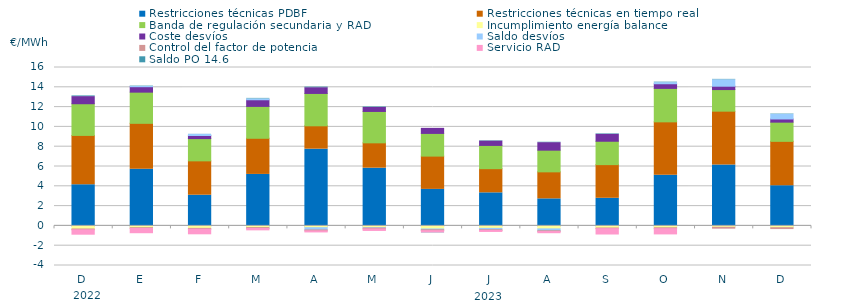
| Category | Restricciones técnicas PDBF | Restricciones técnicas en tiempo real | Banda de regulación secundaria y RAD | Incumplimiento energía balance | Coste desvíos | Saldo desvíos | Control del factor de potencia | Servicio RAD | Saldo PO 14.6 |
|---|---|---|---|---|---|---|---|---|---|
| D | 4.15 | 4.99 | 3.2 | -0.31 | 0.72 | 0 | -0.08 | -0.55 | 0.07 |
| E | 5.72 | 4.64 | 3.15 | -0.18 | 0.55 | 0.02 | -0.08 | -0.53 | 0.04 |
| F | 3.1 | 3.47 | 2.248 | -0.25 | 0.314 | 0.114 | -0.08 | -0.57 | 0.01 |
| M | 5.2 | 3.65 | 3.22 | -0.17 | 0.67 | 0.09 | -0.09 | -0.24 | 0.05 |
| A | 7.75 | 2.36 | 3.27 | -0.18 | 0.58 | -0.23 | -0.09 | -0.21 | 0.06 |
| M | 5.83 | 2.56 | 3.17 | -0.18 | 0.4 | -0.04 | -0.09 | -0.25 | 0.05 |
| J | 3.69 | 3.36 | 2.292 | -0.31 | 0.51 | -0.08 | -0.09 | -0.24 | -0.02 |
| J | 3.34 | 2.44 | 2.348 | -0.25 | 0.44 | -0.14 | -0.07 | -0.2 | 0.04 |
| A | 2.73 | 2.73 | 2.19 | -0.3 | 0.76 | -0.19 | -0.08 | -0.22 | 0.04 |
| S | 2.79 | 3.4 | 2.36 | -0.21 | 0.7 | 0 | -0.07 | -0.64 | 0.05 |
| O | 5.11 | 5.4 | 3.38 | -0.19 | 0.47 | 0.11 | -0.09 | -0.63 | 0.05 |
| N | 6.15 | 5.44 | 2.18 | -0.14 | 0.34 | 0.65 | -0.09 | 0 | 0.04 |
| D | 4.06 | 4.48 | 1.94 | -0.18 | 0.32 | 0.46 | -0.09 | 0 | 0.04 |